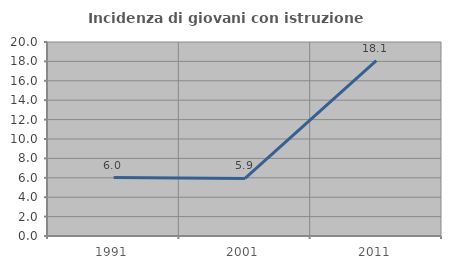
| Category | Incidenza di giovani con istruzione universitaria |
|---|---|
| 1991.0 | 6.024 |
| 2001.0 | 5.941 |
| 2011.0 | 18.085 |